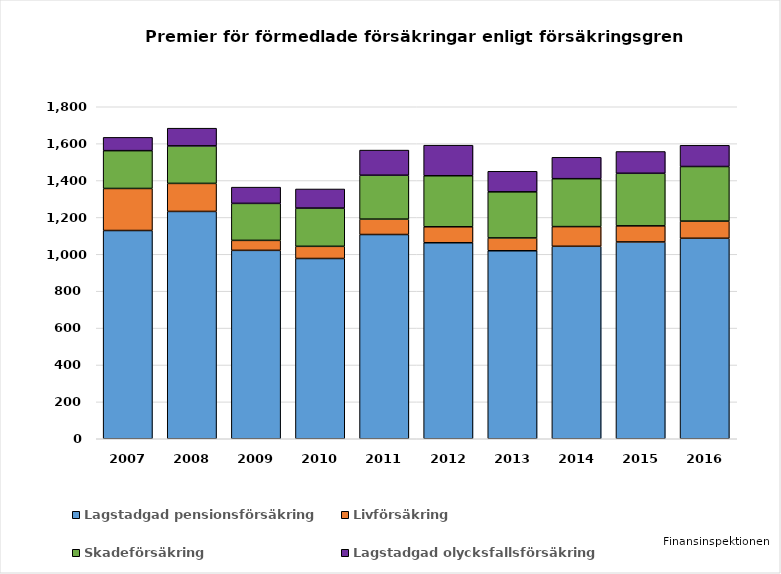
| Category | Lagstadgad pensionsförsäkring | Livförsäkring | Skadeförsäkring | Lagstadgad olycksfallsförsäkring |
|---|---|---|---|---|
| 2007.0 | 1129 | 228 | 205 | 72 |
| 2008.0 | 1232.449 | 151.996 | 203.425 | 95.962 |
| 2009.0 | 1021.457 | 54.107 | 200.56 | 88.041 |
| 2010.0 | 977.321 | 65.95 | 207.341 | 103.558 |
| 2011.0 | 1107.329 | 83.403 | 238.041 | 136.289 |
| 2012.0 | 1062.705 | 86.597 | 276.62 | 165.706 |
| 2013.0 | 1019.216 | 69.648 | 249.823 | 111.515 |
| 2014.0 | 1043.573 | 106.619 | 259.835 | 115.957 |
| 2015.0 | 1067.062 | 87.285 | 284.943 | 118.153 |
| 2016.0 | 1087 | 93 | 296 | 115 |